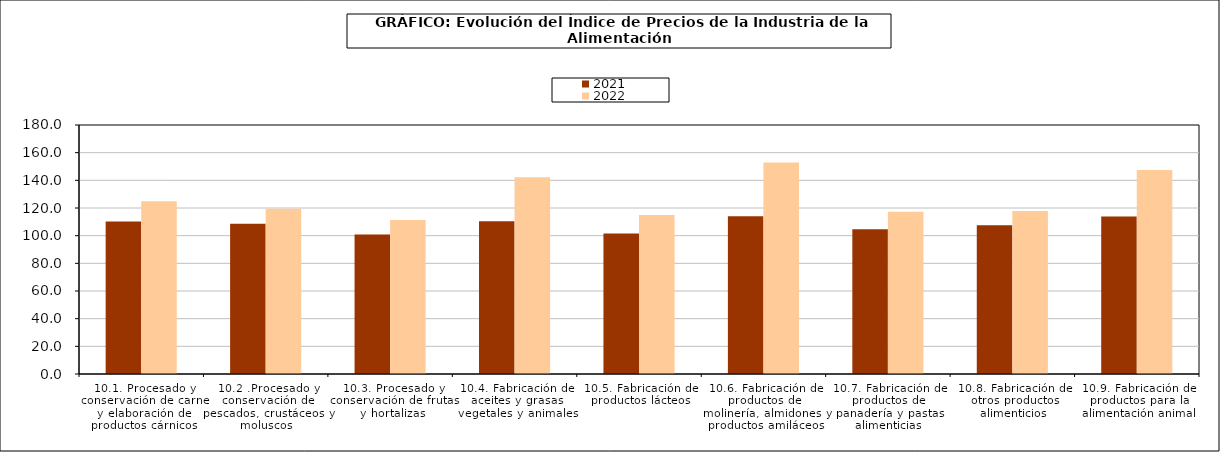
| Category | 2021 | 2022 |
|---|---|---|
| 10.1. Procesado y conservación de carne y elaboración de productos cárnicos | 110.199 | 124.881 |
| 10.2 .Procesado y conservación de pescados, crustáceos y moluscos | 108.541 | 119.457 |
| 10.3. Procesado y conservación de frutas y hortalizas | 100.9 | 111.358 |
| 10.4. Fabricación de aceites y grasas vegetales y animales | 110.373 | 142.193 |
| 10.5. Fabricación de productos lácteos | 101.515 | 114.854 |
| 10.6. Fabricación de productos de molinería, almidones y productos amiláceos | 114.043 | 152.914 |
| 10.7. Fabricación de productos de panadería y pastas alimenticias | 104.723 | 117.232 |
| 10.8. Fabricación de otros productos alimenticios | 107.551 | 117.849 |
| 10.9. Fabricación de productos para la alimentación animal | 113.778 | 147.513 |